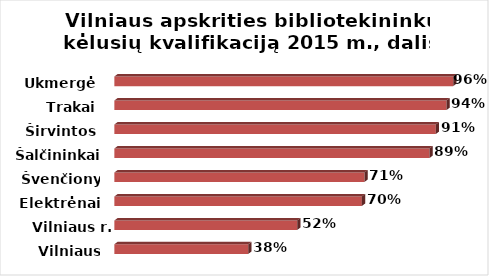
| Category | Series 0 |
|---|---|
| Vilniaus m. | 0.379 |
| Vilniaus r. | 0.517 |
| Elektrėnai | 0.7 |
| Švenčionys | 0.707 |
| Šalčininkai | 0.891 |
| Širvintos | 0.909 |
| Trakai | 0.939 |
| Ukmergė | 0.958 |